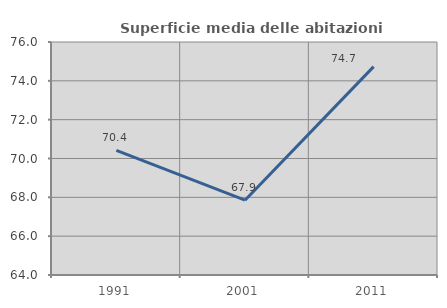
| Category | Superficie media delle abitazioni occupate |
|---|---|
| 1991.0 | 70.416 |
| 2001.0 | 67.852 |
| 2011.0 | 74.733 |